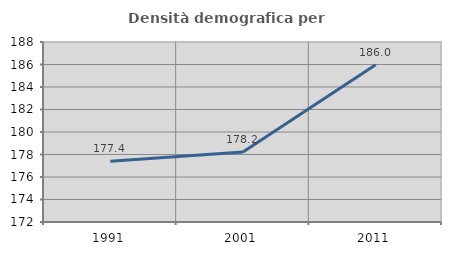
| Category | Densità demografica |
|---|---|
| 1991.0 | 177.401 |
| 2001.0 | 178.233 |
| 2011.0 | 185.98 |